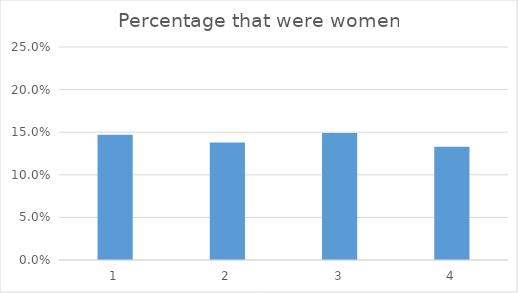
| Category | Percentage that were women |
|---|---|
| 0 | 0.147 |
| 1 | 0.138 |
| 2 | 0.149 |
| 3 | 0.133 |